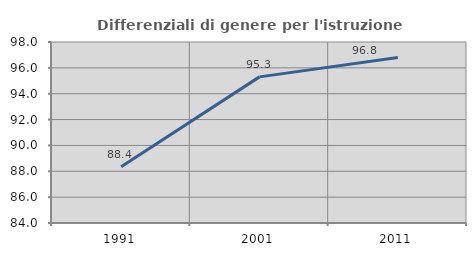
| Category | Differenziali di genere per l'istruzione superiore |
|---|---|
| 1991.0 | 88.359 |
| 2001.0 | 95.303 |
| 2011.0 | 96.809 |